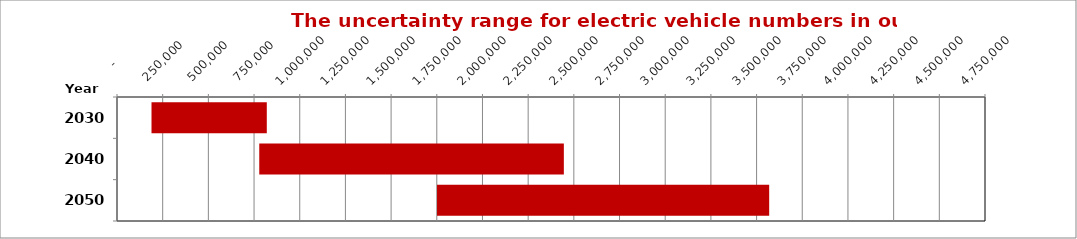
| Category | Min | Inc |
|---|---|---|
| 2030.0 | 188848 | 630889 |
| 2040.0 | 778534 | 1666761 |
| 2050.0 | 1751279 | 1817690 |